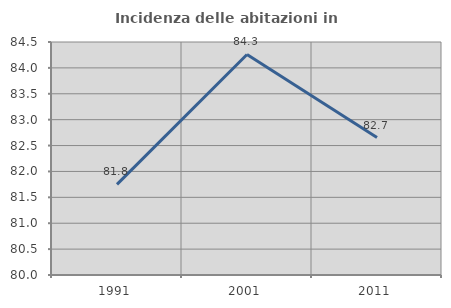
| Category | Incidenza delle abitazioni in proprietà  |
|---|---|
| 1991.0 | 81.751 |
| 2001.0 | 84.259 |
| 2011.0 | 82.656 |